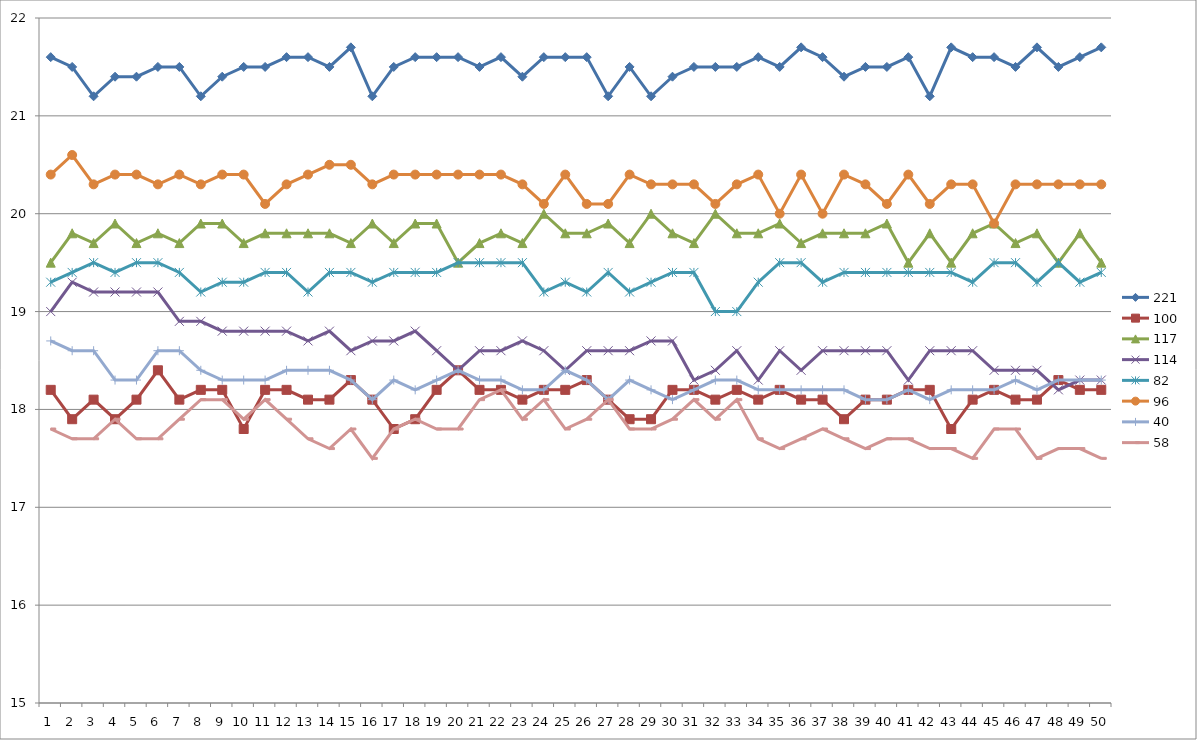
| Category | 221 | 100 | 117 | 114 | 82 | 96 | 40 | 58 |
|---|---|---|---|---|---|---|---|---|
| 0 | 21.6 | 18.2 | 19.5 | 19 | 19.3 | 20.4 | 18.7 | 17.8 |
| 1 | 21.5 | 17.9 | 19.8 | 19.3 | 19.4 | 20.6 | 18.6 | 17.7 |
| 2 | 21.2 | 18.1 | 19.7 | 19.2 | 19.5 | 20.3 | 18.6 | 17.7 |
| 3 | 21.4 | 17.9 | 19.9 | 19.2 | 19.4 | 20.4 | 18.3 | 17.9 |
| 4 | 21.4 | 18.1 | 19.7 | 19.2 | 19.5 | 20.4 | 18.3 | 17.7 |
| 5 | 21.5 | 18.4 | 19.8 | 19.2 | 19.5 | 20.3 | 18.6 | 17.7 |
| 6 | 21.5 | 18.1 | 19.7 | 18.9 | 19.4 | 20.4 | 18.6 | 17.9 |
| 7 | 21.2 | 18.2 | 19.9 | 18.9 | 19.2 | 20.3 | 18.4 | 18.1 |
| 8 | 21.4 | 18.2 | 19.9 | 18.8 | 19.3 | 20.4 | 18.3 | 18.1 |
| 9 | 21.5 | 17.8 | 19.7 | 18.8 | 19.3 | 20.4 | 18.3 | 17.9 |
| 10 | 21.5 | 18.2 | 19.8 | 18.8 | 19.4 | 20.1 | 18.3 | 18.1 |
| 11 | 21.6 | 18.2 | 19.8 | 18.8 | 19.4 | 20.3 | 18.4 | 17.9 |
| 12 | 21.6 | 18.1 | 19.8 | 18.7 | 19.2 | 20.4 | 18.4 | 17.7 |
| 13 | 21.5 | 18.1 | 19.8 | 18.8 | 19.4 | 20.5 | 18.4 | 17.6 |
| 14 | 21.7 | 18.3 | 19.7 | 18.6 | 19.4 | 20.5 | 18.3 | 17.8 |
| 15 | 21.2 | 18.1 | 19.9 | 18.7 | 19.3 | 20.3 | 18.1 | 17.5 |
| 16 | 21.5 | 17.8 | 19.7 | 18.7 | 19.4 | 20.4 | 18.3 | 17.8 |
| 17 | 21.6 | 17.9 | 19.9 | 18.8 | 19.4 | 20.4 | 18.2 | 17.9 |
| 18 | 21.6 | 18.2 | 19.9 | 18.6 | 19.4 | 20.4 | 18.3 | 17.8 |
| 19 | 21.6 | 18.4 | 19.5 | 18.4 | 19.5 | 20.4 | 18.4 | 17.8 |
| 20 | 21.5 | 18.2 | 19.7 | 18.6 | 19.5 | 20.4 | 18.3 | 18.1 |
| 21 | 21.6 | 18.2 | 19.8 | 18.6 | 19.5 | 20.4 | 18.3 | 18.2 |
| 22 | 21.4 | 18.1 | 19.7 | 18.7 | 19.5 | 20.3 | 18.2 | 17.9 |
| 23 | 21.6 | 18.2 | 20 | 18.6 | 19.2 | 20.1 | 18.2 | 18.1 |
| 24 | 21.6 | 18.2 | 19.8 | 18.4 | 19.3 | 20.4 | 18.4 | 17.8 |
| 25 | 21.6 | 18.3 | 19.8 | 18.6 | 19.2 | 20.1 | 18.3 | 17.9 |
| 26 | 21.2 | 18.1 | 19.9 | 18.6 | 19.4 | 20.1 | 18.1 | 18.1 |
| 27 | 21.5 | 17.9 | 19.7 | 18.6 | 19.2 | 20.4 | 18.3 | 17.8 |
| 28 | 21.2 | 17.9 | 20 | 18.7 | 19.3 | 20.3 | 18.2 | 17.8 |
| 29 | 21.4 | 18.2 | 19.8 | 18.7 | 19.4 | 20.3 | 18.1 | 17.9 |
| 30 | 21.5 | 18.2 | 19.7 | 18.3 | 19.4 | 20.3 | 18.2 | 18.1 |
| 31 | 21.5 | 18.1 | 20 | 18.4 | 19 | 20.1 | 18.3 | 17.9 |
| 32 | 21.5 | 18.2 | 19.8 | 18.6 | 19 | 20.3 | 18.3 | 18.1 |
| 33 | 21.6 | 18.1 | 19.8 | 18.3 | 19.3 | 20.4 | 18.2 | 17.7 |
| 34 | 21.5 | 18.2 | 19.9 | 18.6 | 19.5 | 20 | 18.2 | 17.6 |
| 35 | 21.7 | 18.1 | 19.7 | 18.4 | 19.5 | 20.4 | 18.2 | 17.7 |
| 36 | 21.6 | 18.1 | 19.8 | 18.6 | 19.3 | 20 | 18.2 | 17.8 |
| 37 | 21.4 | 17.9 | 19.8 | 18.6 | 19.4 | 20.4 | 18.2 | 17.7 |
| 38 | 21.5 | 18.1 | 19.8 | 18.6 | 19.4 | 20.3 | 18.1 | 17.6 |
| 39 | 21.5 | 18.1 | 19.9 | 18.6 | 19.4 | 20.1 | 18.1 | 17.7 |
| 40 | 21.6 | 18.2 | 19.5 | 18.3 | 19.4 | 20.4 | 18.2 | 17.7 |
| 41 | 21.2 | 18.2 | 19.8 | 18.6 | 19.4 | 20.1 | 18.1 | 17.6 |
| 42 | 21.7 | 17.8 | 19.5 | 18.6 | 19.4 | 20.3 | 18.2 | 17.6 |
| 43 | 21.6 | 18.1 | 19.8 | 18.6 | 19.3 | 20.3 | 18.2 | 17.5 |
| 44 | 21.6 | 18.2 | 19.9 | 18.4 | 19.5 | 19.9 | 18.2 | 17.8 |
| 45 | 21.5 | 18.1 | 19.7 | 18.4 | 19.5 | 20.3 | 18.3 | 17.8 |
| 46 | 21.7 | 18.1 | 19.8 | 18.4 | 19.3 | 20.3 | 18.2 | 17.5 |
| 47 | 21.5 | 18.3 | 19.5 | 18.2 | 19.5 | 20.3 | 18.3 | 17.6 |
| 48 | 21.6 | 18.2 | 19.8 | 18.3 | 19.3 | 20.3 | 18.3 | 17.6 |
| 49 | 21.7 | 18.2 | 19.5 | 18.3 | 19.4 | 20.3 | 18.3 | 17.5 |